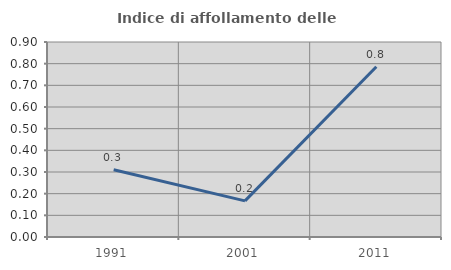
| Category | Indice di affollamento delle abitazioni  |
|---|---|
| 1991.0 | 0.311 |
| 2001.0 | 0.167 |
| 2011.0 | 0.786 |